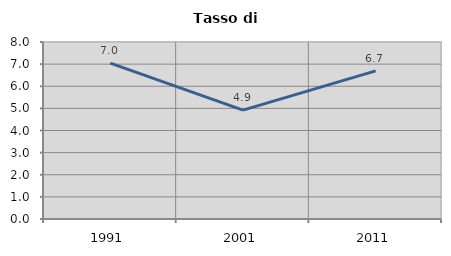
| Category | Tasso di disoccupazione   |
|---|---|
| 1991.0 | 7.047 |
| 2001.0 | 4.919 |
| 2011.0 | 6.696 |